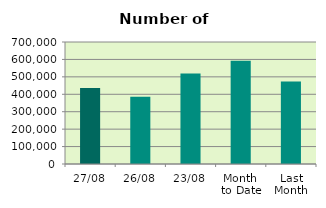
| Category | Series 0 |
|---|---|
| 27/08 | 435846 |
| 26/08 | 386078 |
| 23/08 | 518986 |
| Month 
to Date | 592241.684 |
| Last
Month | 472929.565 |